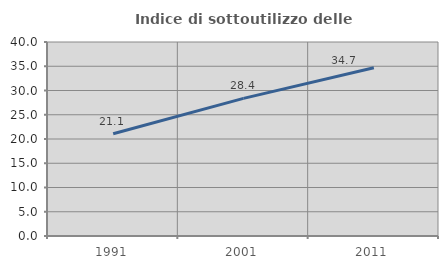
| Category | Indice di sottoutilizzo delle abitazioni  |
|---|---|
| 1991.0 | 21.092 |
| 2001.0 | 28.384 |
| 2011.0 | 34.699 |